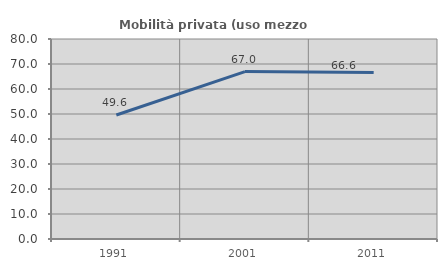
| Category | Mobilità privata (uso mezzo privato) |
|---|---|
| 1991.0 | 49.602 |
| 2001.0 | 66.981 |
| 2011.0 | 66.607 |